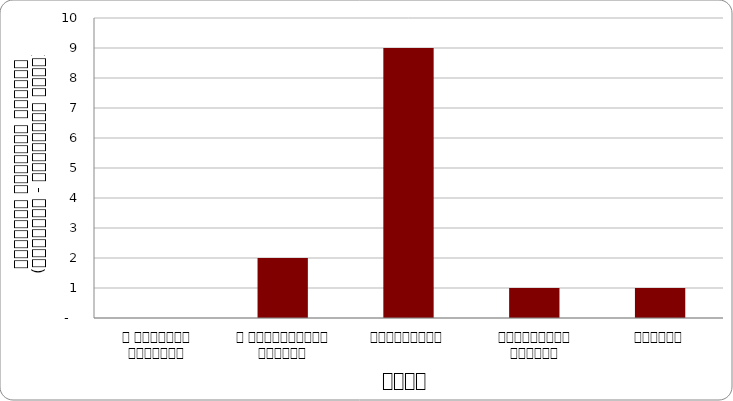
| Category | अन्य |
|---|---|
| द हिमालयन टाइम्स् | 0 |
| द काठमाण्डौं पोस्ट् | 2 |
| कान्तिपुर | 9 |
| अन्नपूर्ण पोस्ट् | 1 |
| नागरिक | 1 |